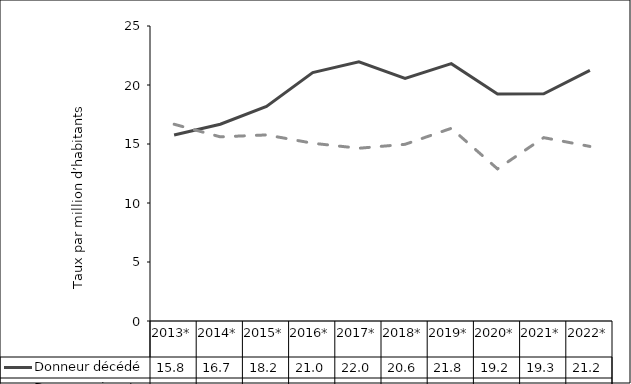
| Category | Donneur décédé  | Donneur vivant  |
|---|---|---|
| 2013* | 15.763 | 16.675 |
| 2014* | 16.677 | 15.605 |
| 2015* | 18.178 | 15.769 |
| 2016* | 21.047 | 15.065 |
| 2017* | 21.973 | 14.639 |
| 2018* | 20.558 | 14.974 |
| 2019* | 21.808 | 16.329 |
| 2020* | 19.233 | 12.892 |
| 2021* | 19.254 | 15.539 |
| 2022* | 21.243 | 14.796 |